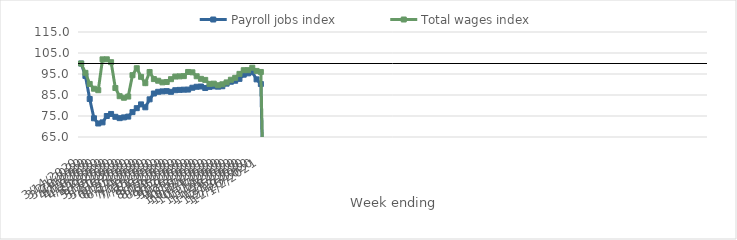
| Category | Payroll jobs index | Total wages index |
|---|---|---|
| 14/03/2020 | 100 | 100 |
| 21/03/2020 | 94.087 | 95.538 |
| 28/03/2020 | 83.11 | 90.272 |
| 04/04/2020 | 73.912 | 87.993 |
| 11/04/2020 | 71.432 | 87.291 |
| 18/04/2020 | 71.958 | 101.976 |
| 25/04/2020 | 74.993 | 101.996 |
| 02/05/2020 | 75.971 | 100.622 |
| 09/05/2020 | 74.62 | 88.33 |
| 16/05/2020 | 73.975 | 84.428 |
| 23/05/2020 | 74.334 | 83.693 |
| 30/05/2020 | 74.714 | 84.257 |
| 06/06/2020 | 76.857 | 94.434 |
| 13/06/2020 | 78.729 | 97.749 |
| 20/06/2020 | 80.531 | 93.66 |
| 27/06/2020 | 79.142 | 90.635 |
| 04/07/2020 | 82.934 | 95.941 |
| 11/07/2020 | 85.72 | 92.58 |
| 18/07/2020 | 86.519 | 91.798 |
| 25/07/2020 | 86.726 | 91.018 |
| 01/08/2020 | 86.845 | 91.193 |
| 08/08/2020 | 86.51 | 92.53 |
| 15/08/2020 | 87.28 | 93.789 |
| 22/08/2020 | 87.44 | 93.883 |
| 29/08/2020 | 87.536 | 93.992 |
| 05/09/2020 | 87.587 | 95.963 |
| 12/09/2020 | 88.458 | 95.798 |
| 19/09/2020 | 88.922 | 93.924 |
| 26/09/2020 | 89.035 | 92.7 |
| 03/10/2020 | 88.32 | 92.191 |
| 10/10/2020 | 88.854 | 90.298 |
| 17/10/2020 | 89.136 | 90.406 |
| 24/10/2020 | 88.969 | 89.645 |
| 31/10/2020 | 89.17 | 90.103 |
| 07/11/2020 | 90.407 | 90.995 |
| 14/11/2020 | 91.31 | 92.266 |
| 21/11/2020 | 91.789 | 93.183 |
| 28/11/2020 | 92.679 | 95.061 |
| 05/12/2020 | 94.665 | 96.81 |
| 12/12/2020 | 95.319 | 96.837 |
| 19/12/2020 | 95.836 | 97.988 |
| 26/12/2020 | 92.447 | 96.472 |
| 02/01/2021 | 90.229 | 95.974 |